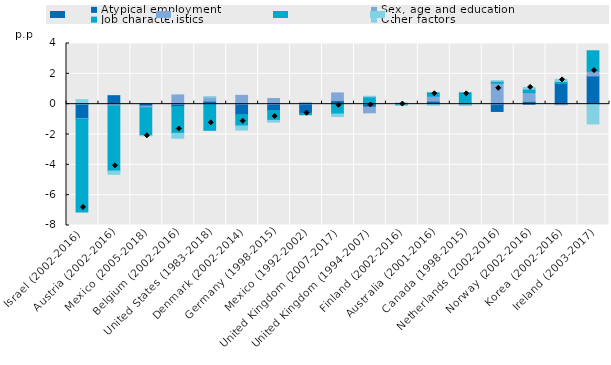
| Category | Atypical employment | Sex, age and education | Job characteristics | Other factors |
|---|---|---|---|---|
| Israel (2002-2016) | -0.938 | -0.039 | -6.127 | 0.296 |
| Austria (2002-2016) | 0.56 | -0.128 | -4.279 | -0.218 |
| Mexico (2005-2018) | -0.122 | -0.127 | -1.819 | -0.02 |
| Belgium (2002-2016) | -0.157 | 0.609 | -1.765 | -0.324 |
| United States (1983-2018) | 0.198 | 0.25 | -1.726 | 0.051 |
| Denmark (2002-2014) | -0.687 | 0.583 | -0.748 | -0.272 |
| Germany (1998-2015) | -0.419 | 0.372 | -0.651 | -0.114 |
| Mexico (1992-2002) | -0.6 | 0.083 | -0.098 | 0.019 |
| United Kingdom (2007-2017) | 0.235 | 0.507 | -0.65 | -0.166 |
| United Kingdom (1994-2007) | -0.191 | -0.382 | 0.484 | 0.038 |
| Finland (2002-2016) | -0.015 | 0.069 | -0.04 | -0.009 |
| Australia (2001-2016) | 0.197 | 0.331 | 0.226 | -0.07 |
| Canada (1998-2015) | 0.06 | -0.066 | 0.694 | -0.005 |
| Netherlands (2002-2016) | -0.481 | 1.384 | 0.127 | 0.016 |
| Norway (2002-2016) | 0.179 | 0.579 | 0.233 | 0.114 |
| Korea (2002-2016) | 1.367 | -0.036 | 0.133 | 0.14 |
| Ireland (2003-2017) | 1.86 | 0.308 | 1.35 | -1.306 |